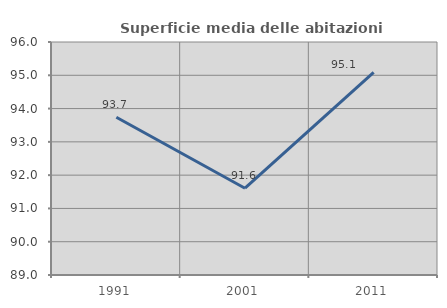
| Category | Superficie media delle abitazioni occupate |
|---|---|
| 1991.0 | 93.74 |
| 2001.0 | 91.607 |
| 2011.0 | 95.087 |